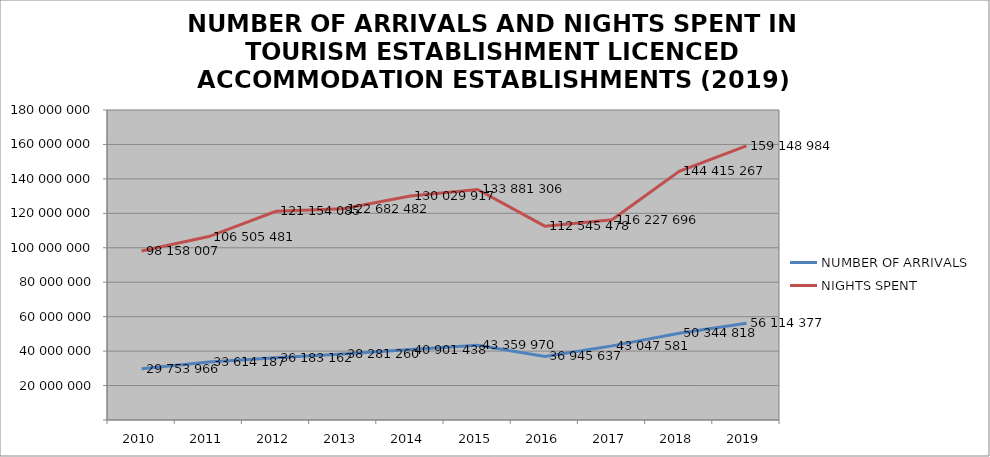
| Category | NUMBER OF ARRIVALS | NIGHTS SPENT |
|---|---|---|
| 2010 | 29753966 | 98158007 |
| 2011 | 33614187 | 106505481 |
| 2012 | 36183162 | 121154085 |
| 2013 | 38281260 | 122682482 |
| 2014 | 40901438 | 130029917 |
| 2015 | 43359970 | 133881306 |
| 2016 | 36945637 | 112545478 |
| 2017 | 43047581 | 116227696 |
| 2018 | 50344818 | 144415267 |
| 2019 | 56114377 | 159148984 |